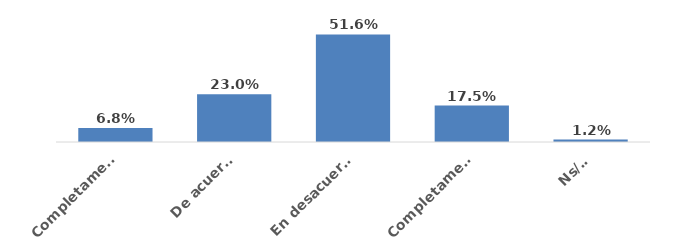
| Category | Series 0 |
|---|---|
| Completamente de acuerdo | 0.068 |
| De acuerdo | 0.23 |
| En desacuerdo | 0.516 |
| Completamente en desacuerdo | 0.175 |
| Ns/Nr | 0.012 |